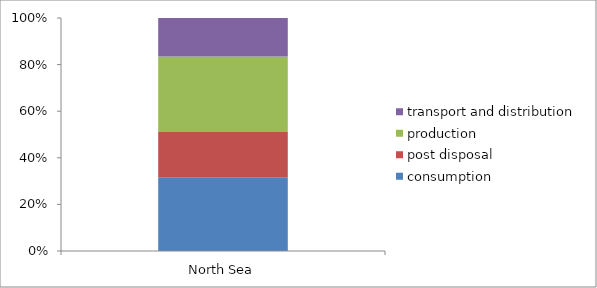
| Category | consumption | post disposal | production | transport and distribution |
|---|---|---|---|---|
| North Sea | 0.317 | 0.194 | 0.324 | 0.165 |